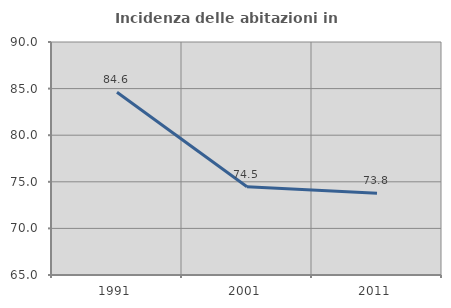
| Category | Incidenza delle abitazioni in proprietà  |
|---|---|
| 1991.0 | 84.602 |
| 2001.0 | 74.461 |
| 2011.0 | 73.765 |